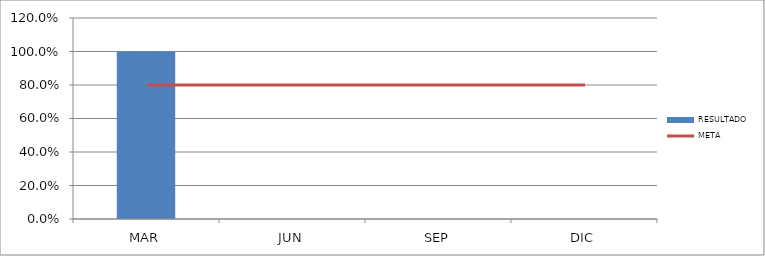
| Category | RESULTADO |
|---|---|
| MAR | 1 |
| JUN | 0 |
| SEP | 0 |
| DIC | 0 |